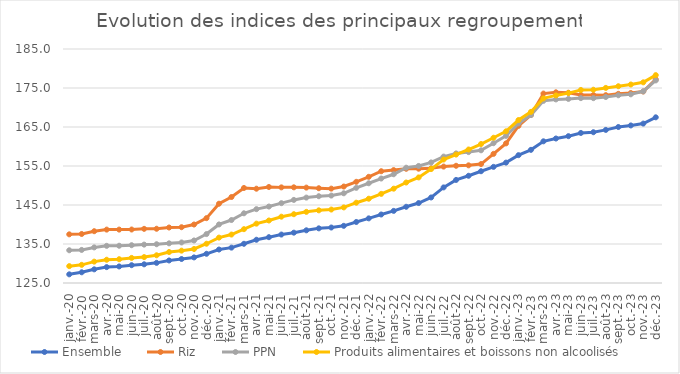
| Category | Ensemble | Riz | PPN | Produits alimentaires et boissons non alcoolisés |
|---|---|---|---|---|
| 2020-01-01 | 127.22 | 137.477 | 133.394 | 129.324 |
| 2020-02-01 | 127.747 | 137.571 | 133.482 | 129.658 |
| 2020-03-01 | 128.503 | 138.279 | 134.127 | 130.477 |
| 2020-04-01 | 129.073 | 138.691 | 134.528 | 130.962 |
| 2020-05-01 | 129.246 | 138.695 | 134.553 | 131.1 |
| 2020-06-01 | 129.569 | 138.715 | 134.691 | 131.433 |
| 2020-07-01 | 129.792 | 138.884 | 134.842 | 131.639 |
| 2020-08-01 | 130.165 | 138.908 | 134.939 | 132.108 |
| 2020-09-01 | 130.779 | 139.227 | 135.17 | 132.94 |
| 2020-10-01 | 131.152 | 139.307 | 135.396 | 133.293 |
| 2020-11-01 | 131.562 | 139.996 | 135.904 | 133.717 |
| 2020-12-01 | 132.488 | 141.627 | 137.548 | 135.07 |
| 2021-01-01 | 133.582 | 145.33 | 140.014 | 136.64 |
| 2021-02-01 | 134.068 | 147.047 | 141.147 | 137.422 |
| 2021-03-01 | 135.051 | 149.367 | 142.872 | 138.8 |
| 2021-04-01 | 136.088 | 149.178 | 143.938 | 140.217 |
| 2021-05-01 | 136.75 | 149.619 | 144.606 | 141.028 |
| 2021-06-01 | 137.421 | 149.519 | 145.469 | 142.002 |
| 2021-07-01 | 137.905 | 149.532 | 146.302 | 142.639 |
| 2021-08-01 | 138.51 | 149.461 | 146.899 | 143.242 |
| 2021-09-01 | 139.014 | 149.302 | 147.252 | 143.631 |
| 2021-10-01 | 139.227 | 149.196 | 147.416 | 143.832 |
| 2021-11-01 | 139.66 | 149.736 | 148.006 | 144.381 |
| 2021-12-01 | 140.647 | 150.942 | 149.401 | 145.589 |
| 2022-01-01 | 141.575 | 152.225 | 150.572 | 146.611 |
| 2022-02-01 | 142.565 | 153.658 | 151.785 | 147.854 |
| 2022-03-01 | 143.49 | 153.947 | 152.881 | 149.188 |
| 2022-04-01 | 144.542 | 154.286 | 154.56 | 150.765 |
| 2022-05-01 | 145.5 | 154.308 | 155.011 | 152.074 |
| 2022-06-01 | 146.929 | 154.397 | 155.916 | 154.212 |
| 2022-07-01 | 149.51 | 154.848 | 157.411 | 156.664 |
| 2022-08-01 | 151.429 | 155.056 | 158.224 | 157.93 |
| 2022-09-01 | 152.495 | 155.168 | 158.567 | 159.229 |
| 2022-10-01 | 153.659 | 155.499 | 159.025 | 160.634 |
| 2022-11-01 | 154.778 | 158.112 | 160.842 | 162.244 |
| 2022-12-01 | 155.868 | 160.795 | 162.741 | 163.889 |
| 2023-01-01 | 157.78 | 165.289 | 165.928 | 166.783 |
| 2023-02-01 | 159.146 | 168.082 | 168.07 | 168.879 |
| 2023-03-01 | 161.33 | 173.573 | 171.71 | 172.334 |
| 2023-04-01 | 162.047 | 173.895 | 172.074 | 173.1 |
| 2023-05-01 | 162.649 | 173.786 | 172.207 | 173.691 |
| 2023-06-01 | 163.471 | 173.218 | 172.406 | 174.499 |
| 2023-07-01 | 163.661 | 173.19 | 172.397 | 174.557 |
| 2023-08-01 | 164.258 | 173.164 | 172.694 | 175.026 |
| 2023-09-01 | 164.998 | 173.503 | 173.138 | 175.45 |
| 2023-10-01 | 165.397 | 173.714 | 173.381 | 175.897 |
| 2023-11-01 | 165.874 | 174.101 | 174.147 | 176.454 |
| 2023-12-01 | 167.482 | 177.228 | 176.947 | 178.302 |